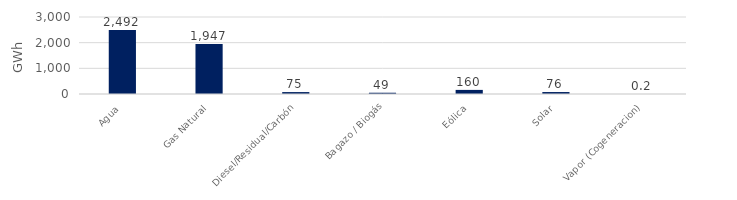
| Category | Series 0 |
|---|---|
| Agua | 2491.961 |
| Gas Natural | 1947.343 |
| Diesel/Residual/Carbón | 74.768 |
| Bagazo / Biogás | 49.311 |
| Eólica | 159.688 |
| Solar | 76.366 |
| Vapor (Cogeneracion) | 0.22 |